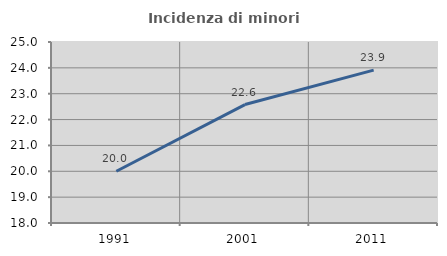
| Category | Incidenza di minori stranieri |
|---|---|
| 1991.0 | 20 |
| 2001.0 | 22.581 |
| 2011.0 | 23.913 |